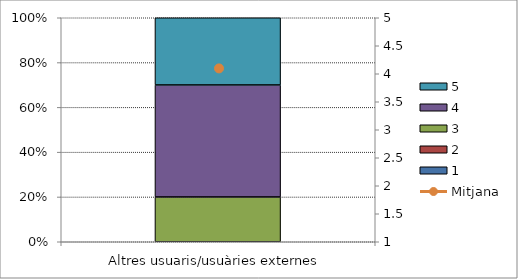
| Category | 1 | 2 | 3 | 4 | 5 |
|---|---|---|---|---|---|
| Altres usuaris/usuàries externes | 0 | 0 | 2 | 5 | 3 |